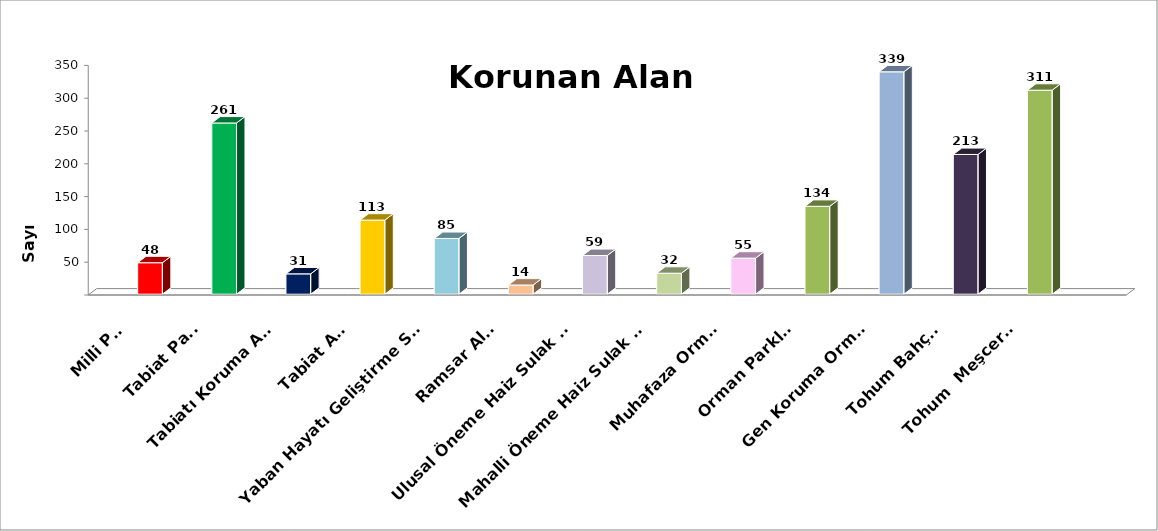
| Category | Series 0 | Series 1 | Series 2 |
|---|---|---|---|
| Milli Park |  |  | 48 |
| Tabiat Parkı |  |  | 261 |
| Tabiatı Koruma Alanı |  |  | 31 |
| Tabiat Anıtı |  |  | 113 |
| Yaban Hayatı Geliştirme Sahası |  |  | 85 |
| Ramsar Alanı |  |  | 14 |
| Ulusal Öneme Haiz Sulak Alan |  |  | 59 |
| Mahalli Öneme Haiz Sulak Alan |  |  | 32 |
| Muhafaza Ormanı |  |  | 55 |
| Orman Parkları |  |  | 134 |
| Gen Koruma Ormanı |  |  | 339 |
| Tohum Bahçesi |  |  | 213 |
| Tohum  Meşceresi |  |  | 311 |